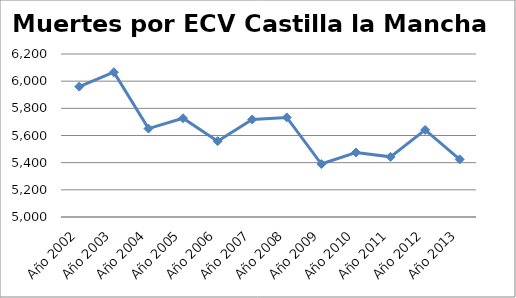
| Category | Series 0 |
|---|---|
| Año 2002 | 5960 |
| Año 2003 | 6066 |
| Año 2004 | 5651 |
| Año 2005 | 5727 |
| Año 2006 | 5558 |
| Año 2007 | 5718 |
| Año 2008 | 5733 |
| Año 2009 | 5390 |
| Año 2010 | 5475 |
| Año 2011 | 5443 |
| Año 2012 | 5641 |
| Año 2013 | 5424 |